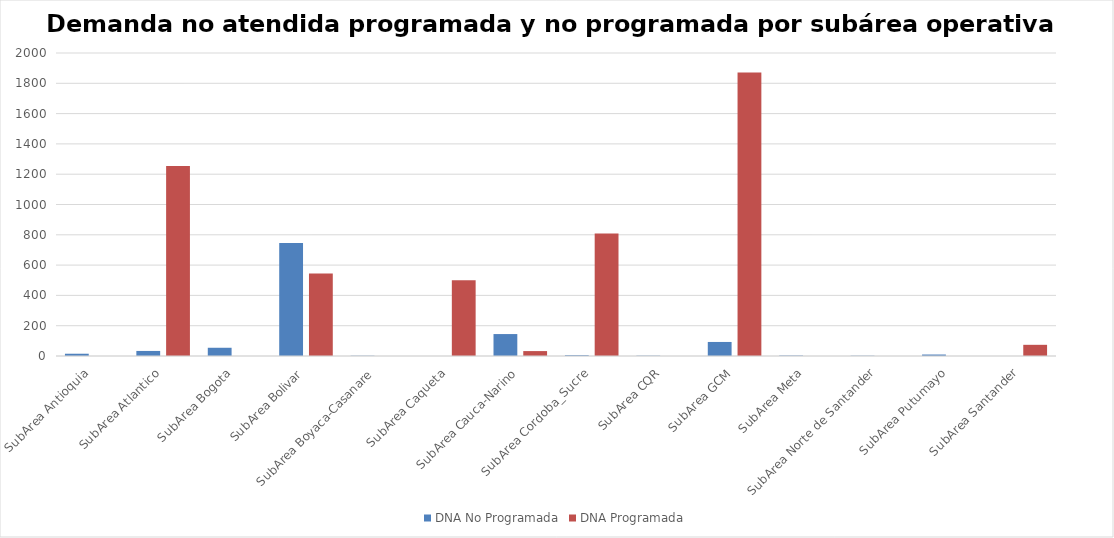
| Category | DNA No Programada | DNA Programada |
|---|---|---|
| SubArea Antioquia | 15.01 | 0 |
| SubArea Atlantico | 33.39 | 1254.61 |
| SubArea Bogota | 54.36 | 0 |
| SubArea Bolivar | 745.62 | 543.81 |
| SubArea Boyaca-Casanare | 1.75 | 0 |
| SubArea Caqueta | 0 | 500.55 |
| SubArea Cauca-Narino | 144.84 | 32.47 |
| SubArea Cordoba_Sucre | 5.29 | 808.5 |
| SubArea CQR | 2.03 | 0 |
| SubArea GCM | 92.66 | 1872.06 |
| SubArea Meta | 2.96 | 0 |
| SubArea Norte de Santander | 1.8 | 0 |
| SubArea Putumayo | 9.78 | 0 |
| SubArea Santander | 0 | 73.8 |